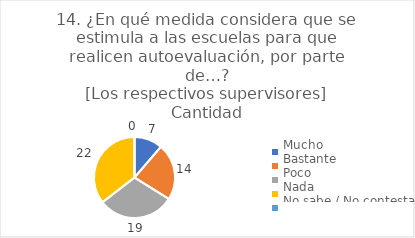
| Category | 14. ¿En qué medida considera que se estimula a las escuelas para que realicen autoevaluación, por parte de…?
[Los respectivos supervisores] |
|---|---|
| Mucho  | 0.113 |
| Bastante  | 0.226 |
| Poco  | 0.306 |
| Nada  | 0.355 |
| No sabe / No contesta | 0 |